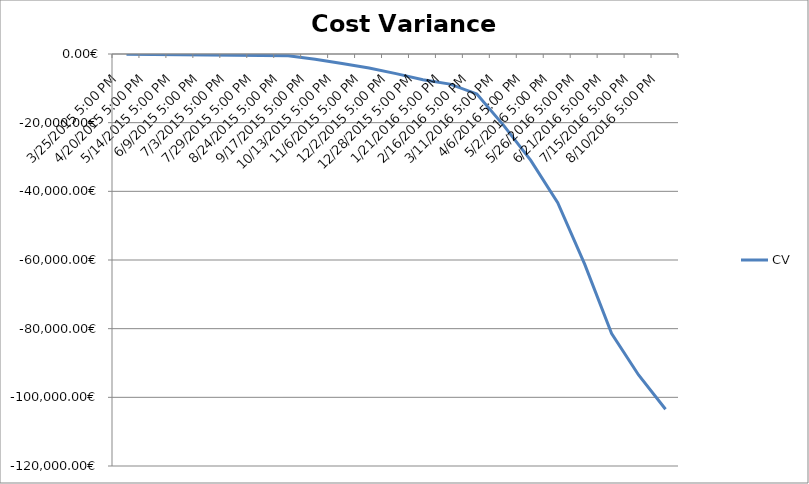
| Category | CV |
|---|---|
| 3/25/2015 5:00 PM | -72.765 |
| 4/20/2015 5:00 PM | -145.53 |
| 5/14/2015 5:00 PM | -218.295 |
| 6/9/2015 5:00 PM | -291.06 |
| 7/3/2015 5:00 PM | -363.824 |
| 7/29/2015 5:00 PM | -436.59 |
| 8/24/2015 5:00 PM | -509.356 |
| 9/17/2015 5:00 PM | -1514.952 |
| 10/13/2015 5:00 PM | -2787.077 |
| 11/6/2015 5:00 PM | -4059.196 |
| 12/2/2015 5:00 PM | -5717.033 |
| 12/28/2015 5:00 PM | -7503.443 |
| 1/21/2016 5:00 PM | -8775.556 |
| 2/16/2016 5:00 PM | -11626.629 |
| 3/11/2016 5:00 PM | -20856.4 |
| 4/6/2016 5:00 PM | -30989.776 |
| 5/2/2016 5:00 PM | -43284.939 |
| 5/26/2016 5:00 PM | -61214.248 |
| 6/21/2016 5:00 PM | -81398.563 |
| 7/15/2016 5:00 PM | -93480.936 |
| 8/10/2016 5:00 PM | -103475 |